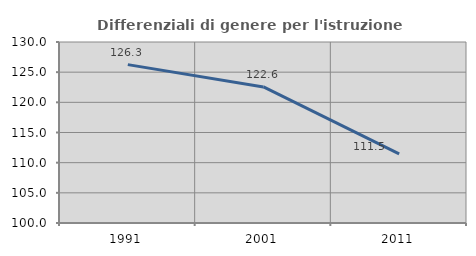
| Category | Differenziali di genere per l'istruzione superiore |
|---|---|
| 1991.0 | 126.252 |
| 2001.0 | 122.558 |
| 2011.0 | 111.457 |